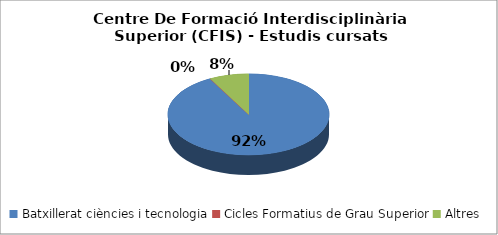
| Category | Centre De Formació Interdisciplinària Superior (CFIS) - Estudis cursats |
|---|---|
| Batxillerat ciències i tecnologia | 0.921 |
| Cicles Formatius de Grau Superior | 0 |
| Altres | 0.079 |